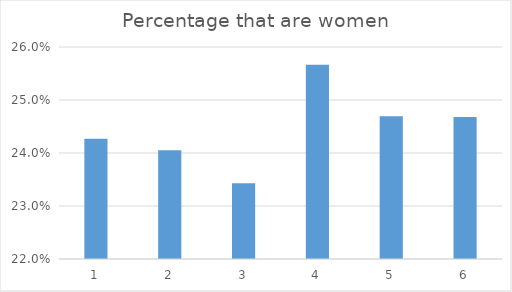
| Category | Percentage that are women |
|---|---|
| 0 | 0.243 |
| 1 | 0.241 |
| 2 | 0.234 |
| 3 | 0.257 |
| 4 | 0.247 |
| 5 | 0.247 |